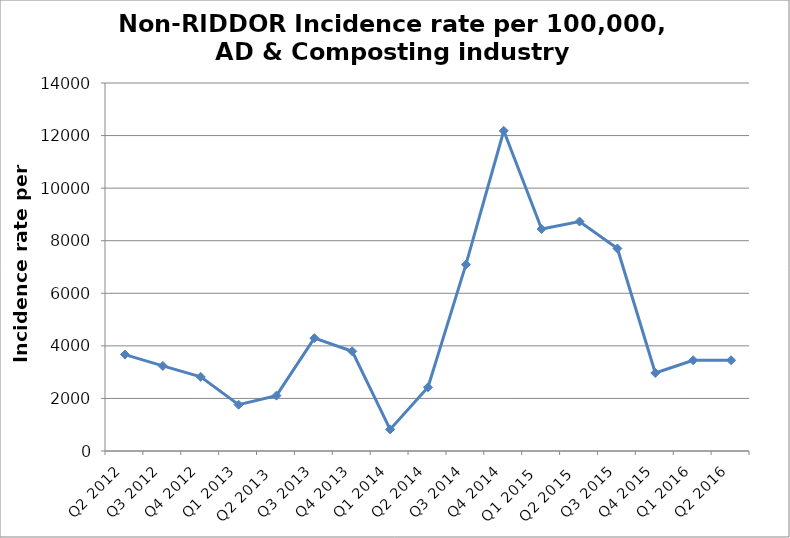
| Category | Series 0 |
|---|---|
| Q2 2012 | 3667.745 |
| Q3 2012 | 3236.246 |
| Q4 2012 | 2818.792 |
| Q1 2013 | 1760 |
| Q2 2013  | 2106.969 |
| Q3 2013 | 4292.528 |
| Q4 2013 | 3791.983 |
| Q1 2014 | 821.722 |
| Q2 2014 | 2424.242 |
| Q3 2014 | 7092.199 |
| Q4 2014 | 12180.451 |
| Q1 2015  | 8443.709 |
| Q2 2015  | 8730.159 |
| Q3 2015 | 7703.281 |
| Q4 2015 | 2968.037 |
| Q1 2016 | 3451.777 |
| Q2 2016 | 3451.777 |